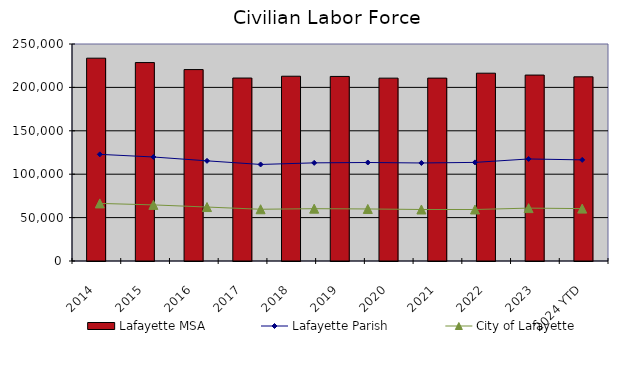
| Category | Lafayette MSA |
|---|---|
| 2014 | 233661.833 |
| 2015 | 228597.667 |
| 2016 | 220529.167 |
| 2017 | 210780.417 |
| 2018 | 212876.5 |
| 2019 | 212632.667 |
| 2020 | 210660.333 |
| 2021 | 210685.5 |
| 2022 | 216361.083 |
| 2023 | 214198 |
| 2024 YTD | 212171 |